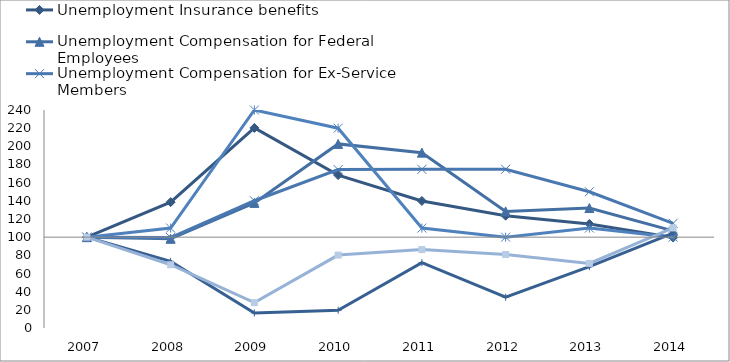
| Category | Unemployment Insurance benefits | Unemployment Compensation for Federal Employees | Unemployment Compensation for Ex-Service Members | Railroad Unemployment Insurance | Trade Readjustment Allowances | Emergency Unemployment Compensation (EUC08) | Federal-State Extended Benefits (EB) | State Additional Benefits (AB) |
|---|---|---|---|---|---|---|---|---|
| 2007.0 | 100 | 100 | 100 | 100 | 100 |  |  | 100 |
| 2008.0 | 138.577 | 98.165 | 99.59 | 110 | 73.356 |  |  | 69.678 |
| 2009.0 | 220.27 | 137.705 | 140.084 | 240 | 16.576 |  |  | 27.92 |
| 2010.0 | 168.318 | 202.68 | 174.388 | 220 | 19.586 |  |  | 80.261 |
| 2011.0 | 139.88 | 193.042 | 174.648 | 110 | 71.928 |  |  | 86.316 |
| 2012.0 | 123.698 | 128.382 | 174.725 | 100 | 33.907 |  |  | 80.945 |
| 2013.0 | 114.596 | 132.064 | 149.99 | 110 | 67.49 |  |  | 71.136 |
| 2014.0 | 99.559 | 106.91 | 115.278 | 100 | 104.491 |  |  | 110.217 |